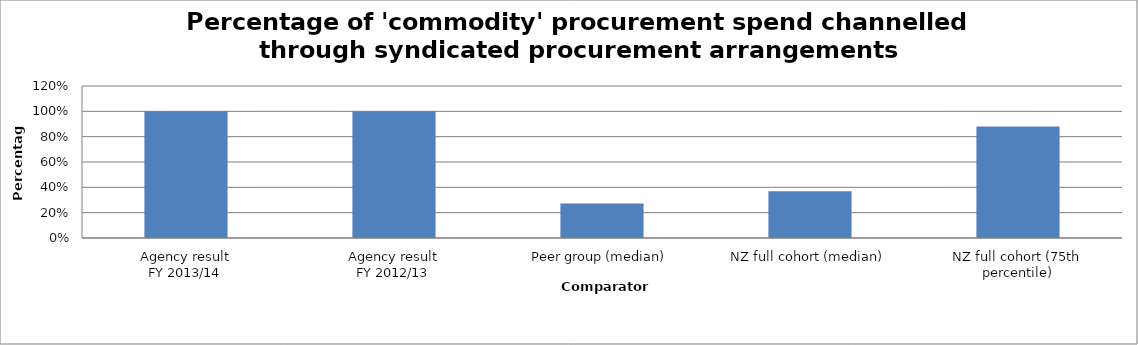
| Category | Result |
|---|---|
| Agency result
FY 2013/14 | 1 |
| Agency result
FY 2012/13 | 1 |
| Peer group (median) | 0.272 |
| NZ full cohort (median) | 0.37 |
| NZ full cohort (75th percentile) | 0.88 |